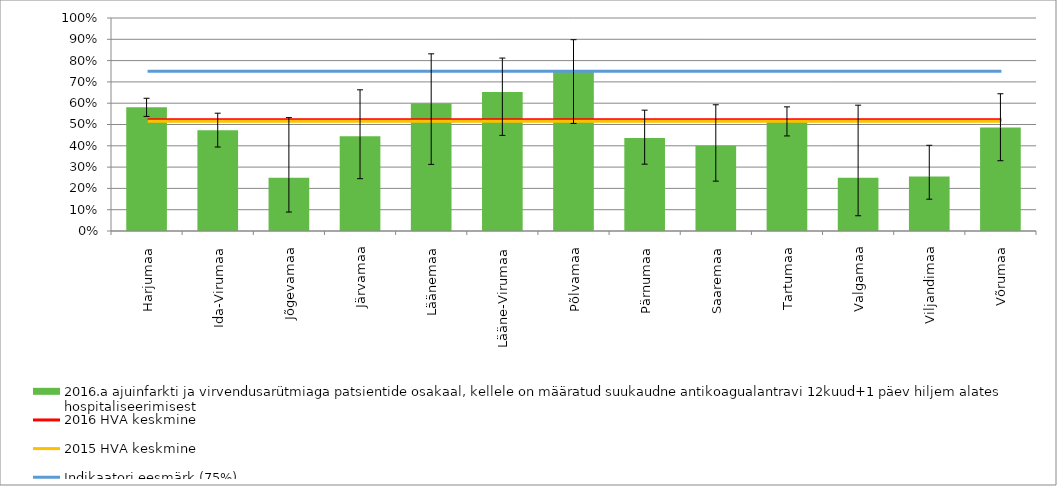
| Category | 2016.a ajuinfarkti ja virvendusarütmiaga patsientide osakaal, kellele on määratud suukaudne antikoagualantravi 12kuud+1 päev hiljem alates hospitaliseerimisest |
|---|---|
| Harjumaa | 0.581 |
| Ida-Virumaa | 0.473 |
| Jõgevamaa | 0.25 |
| Järvamaa | 0.444 |
| Läänemaa | 0.6 |
| Lääne-Virumaa | 0.652 |
| Põlvamaa | 0.75 |
| Pärnumaa | 0.436 |
| Saaremaa | 0.4 |
| Tartumaa | 0.515 |
| Valgamaa | 0.25 |
| Viljandimaa | 0.256 |
| Võrumaa | 0.486 |